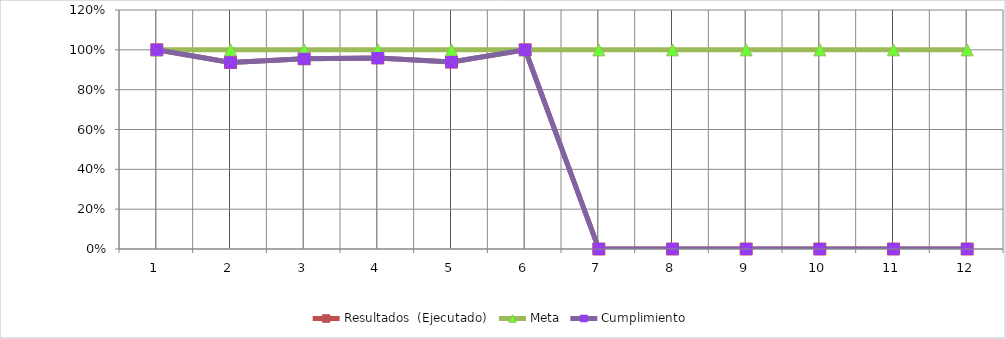
| Category | Resultados  (Ejecutado) | Meta | Cumplimiento |
|---|---|---|---|
| 0 | 1 | 1 | 1 |
| 1 | 0.937 | 1 | 0.937 |
| 2 | 0.955 | 1 | 0.955 |
| 3 | 0.959 | 1 | 0.959 |
| 4 | 0.938 | 1 | 0.938 |
| 5 | 1 | 1 | 1 |
| 6 | 0 | 1 | 0 |
| 7 | 0 | 1 | 0 |
| 8 | 0 | 1 | 0 |
| 9 | 0 | 1 | 0 |
| 10 | 0 | 1 | 0 |
| 11 | 0 | 1 | 0 |